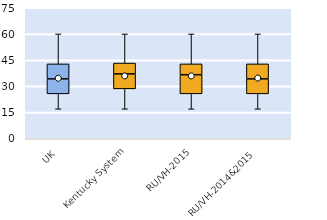
| Category | 25th | 50th | 75th |
|---|---|---|---|
| UK | 25.714 | 8.571 | 8.571 |
| Kentucky System | 28.571 | 8.571 | 6.19 |
| RU/VH-2015 | 25.714 | 10.952 | 6.19 |
| RU/VH-2014&2015 | 25.714 | 8.571 | 8.571 |